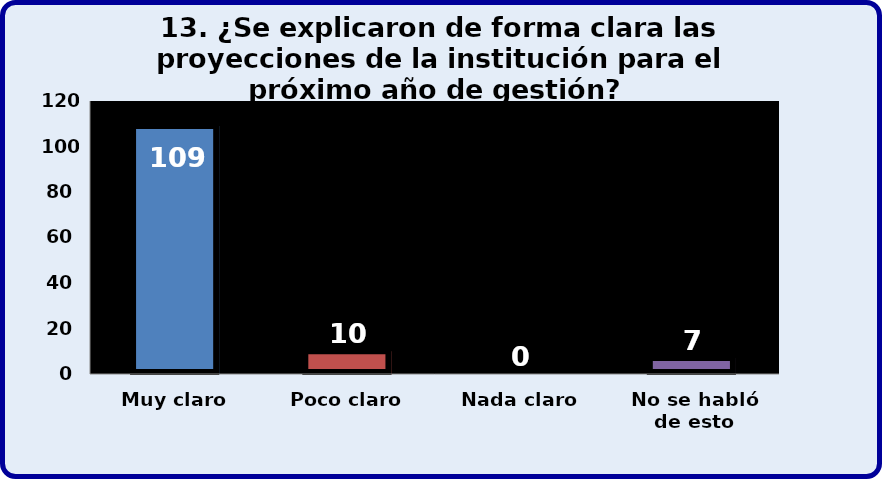
| Category | Series 0 |
|---|---|
| Muy claro | 109 |
| Poco claro | 10 |
| Nada claro | 0 |
| No se habló de esto | 7 |